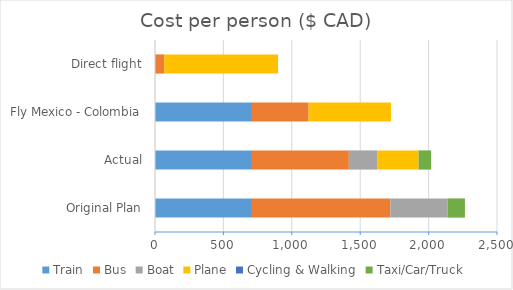
| Category | Train | Bus | Boat | Plane | Cycling & Walking | Taxi/Car/Truck |
|---|---|---|---|---|---|---|
| Original Plan | 709 | 1011.34 | 419.62 | 0 | 0 | 125.68 |
| Actual | 709 | 707.98 | 209.81 | 300 | 0 | 91.92 |
| Fly Mexico - Colombia | 709 | 414.02 | 0 | 602 | 0 | 0 |
| Direct flight | 0 | 67.65 | 0 | 832 | 0 | 0 |